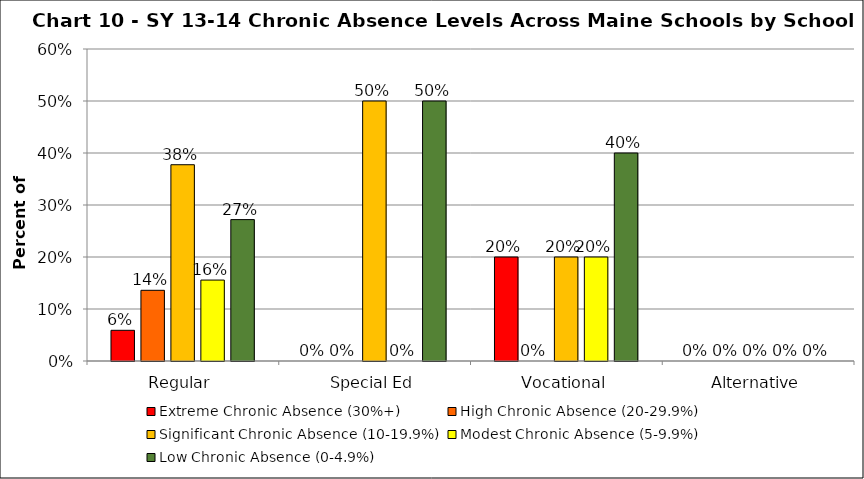
| Category | Extreme Chronic Absence (30%+) | High Chronic Absence (20-29.9%) | Significant Chronic Absence (10-19.9%) | Modest Chronic Absence (5-9.9%) | Low Chronic Absence (0-4.9%) |
|---|---|---|---|---|---|
| 0 | 0.059 | 0.136 | 0.377 | 0.156 | 0.272 |
| 1 | 0 | 0 | 0.5 | 0 | 0.5 |
| 2 | 0.2 | 0 | 0.2 | 0.2 | 0.4 |
| 3 | 0 | 0 | 0 | 0 | 0 |